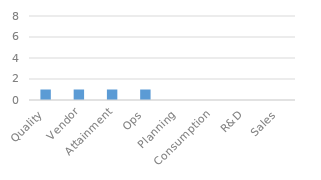
| Category | Series 0 |
|---|---|
| Quality | 1 |
| Vendor | 1 |
| Attainment | 1 |
| Ops | 1 |
| Planning | 0 |
| Consumption | 0 |
| R&D | 0 |
| Sales | 0 |